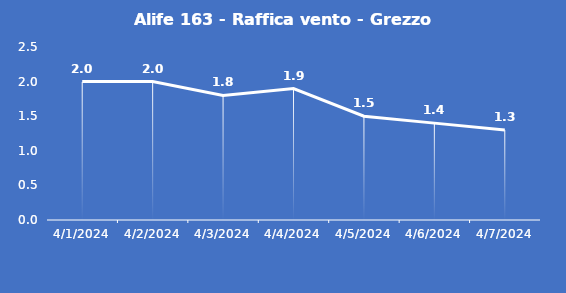
| Category | Alife 163 - Raffica vento - Grezzo (m/s) |
|---|---|
| 4/1/24 | 2 |
| 4/2/24 | 2 |
| 4/3/24 | 1.8 |
| 4/4/24 | 1.9 |
| 4/5/24 | 1.5 |
| 4/6/24 | 1.4 |
| 4/7/24 | 1.3 |